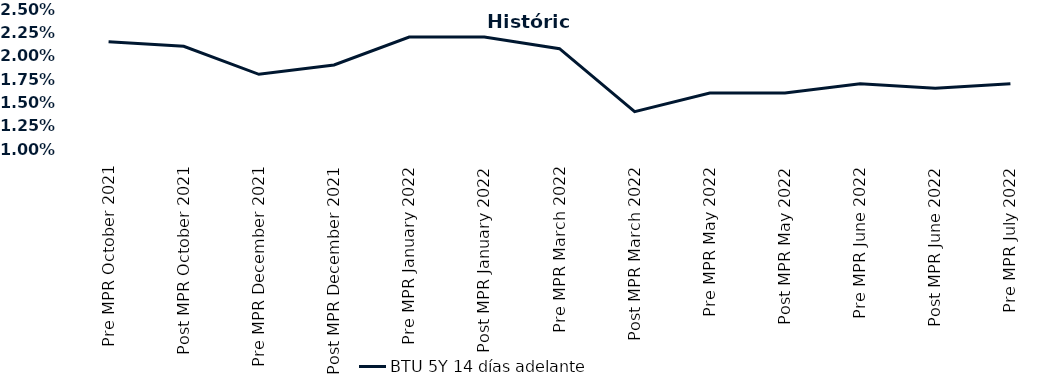
| Category | BTU 5Y 14 días adelante |
|---|---|
| Pre MPR October 2021 | 0.022 |
| Post MPR October 2021 | 0.021 |
| Pre MPR December 2021 | 0.018 |
| Post MPR December 2021 | 0.019 |
| Pre MPR January 2022 | 0.022 |
| Post MPR January 2022 | 0.022 |
| Pre MPR March 2022 | 0.021 |
| Post MPR March 2022 | 0.014 |
| Pre MPR May 2022 | 0.016 |
| Post MPR May 2022 | 0.016 |
| Pre MPR June 2022 | 0.017 |
| Post MPR June 2022 | 0.016 |
| Pre MPR July 2022 | 0.017 |